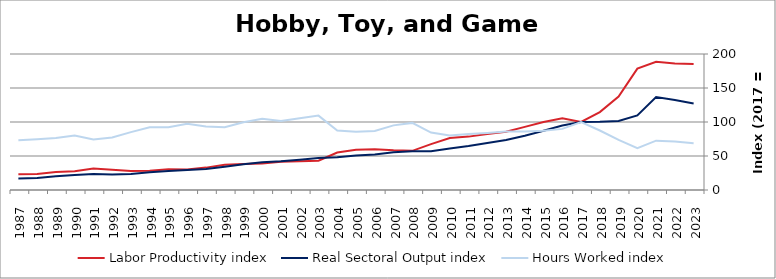
| Category | Labor Productivity index | Real Sectoral Output index | Hours Worked index |
|---|---|---|---|
| 2023.0 | 185.139 | 127.279 | 68.748 |
| 2022.0 | 186.106 | 132.47 | 71.18 |
| 2021.0 | 188.492 | 136.678 | 72.511 |
| 2020.0 | 178.51 | 109.636 | 61.417 |
| 2019.0 | 137.326 | 101.383 | 73.827 |
| 2018.0 | 114.615 | 100.301 | 87.511 |
| 2017.0 | 100 | 100 | 100 |
| 2016.0 | 105.502 | 94.84 | 89.894 |
| 2015.0 | 100.012 | 87.053 | 87.043 |
| 2014.0 | 92.794 | 79.895 | 86.099 |
| 2013.0 | 85.664 | 73.58 | 85.894 |
| 2012.0 | 82.497 | 69.191 | 83.871 |
| 2011.0 | 78.507 | 64.584 | 82.265 |
| 2010.0 | 76.323 | 61.151 | 80.122 |
| 2009.0 | 67.42 | 56.933 | 84.444 |
| 2008.0 | 57.57 | 56.817 | 98.691 |
| 2007.0 | 58.378 | 55.493 | 95.057 |
| 2006.0 | 60.106 | 52.195 | 86.837 |
| 2005.0 | 59.103 | 50.72 | 85.816 |
| 2004.0 | 55.108 | 48.25 | 87.556 |
| 2003.0 | 43.03 | 47.061 | 109.367 |
| 2002.0 | 42.298 | 44.638 | 105.533 |
| 2001.0 | 41.688 | 42.248 | 101.344 |
| 2000.0 | 38.946 | 40.816 | 104.8 |
| 1999.0 | 38.17 | 38.023 | 99.614 |
| 1998.0 | 37.126 | 34.23 | 92.2 |
| 1997.0 | 32.917 | 30.76 | 93.447 |
| 1996.0 | 30.243 | 29.434 | 97.324 |
| 1995.0 | 30.356 | 28.067 | 92.46 |
| 1994.0 | 28.133 | 25.946 | 92.228 |
| 1993.0 | 27.813 | 23.68 | 85.14 |
| 1992.0 | 29.729 | 22.978 | 77.292 |
| 1991.0 | 31.713 | 23.574 | 74.336 |
| 1990.0 | 27.443 | 21.993 | 80.138 |
| 1989.0 | 26.362 | 20.194 | 76.603 |
| 1988.0 | 23.636 | 17.676 | 74.784 |
| 1987.0 | 23.006 | 16.836 | 73.18 |